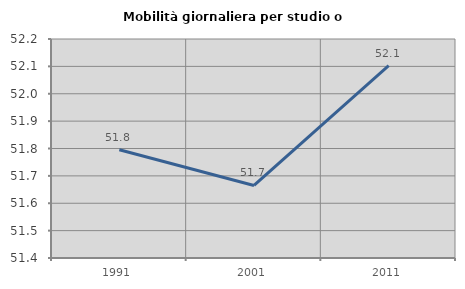
| Category | Mobilità giornaliera per studio o lavoro |
|---|---|
| 1991.0 | 51.796 |
| 2001.0 | 51.665 |
| 2011.0 | 52.102 |